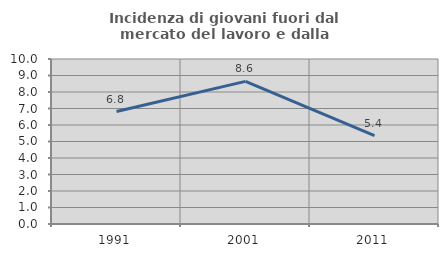
| Category | Incidenza di giovani fuori dal mercato del lavoro e dalla formazione  |
|---|---|
| 1991.0 | 6.818 |
| 2001.0 | 8.642 |
| 2011.0 | 5.357 |